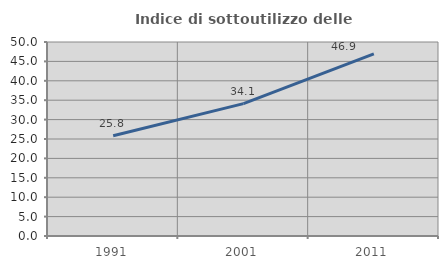
| Category | Indice di sottoutilizzo delle abitazioni  |
|---|---|
| 1991.0 | 25.825 |
| 2001.0 | 34.11 |
| 2011.0 | 46.922 |